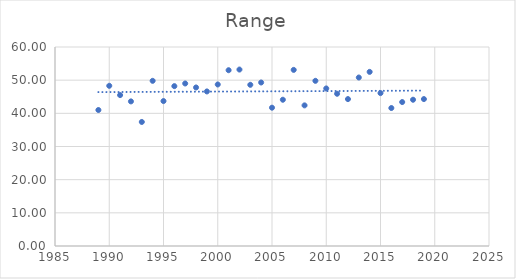
| Category | Range |
|---|---|
| 1989.0 | 41 |
| 1990.0 | 48.3 |
| 1991.0 | 45.5 |
| 1992.0 | 43.6 |
| 1993.0 | 37.4 |
| 1994.0 | 49.8 |
| 1995.0 | 43.7 |
| 1996.0 | 48.2 |
| 1997.0 | 49 |
| 1998.0 | 47.8 |
| 1999.0 | 46.6 |
| 2000.0 | 48.7 |
| 2001.0 | 53 |
| 2002.0 | 53.2 |
| 2003.0 | 48.6 |
| 2004.0 | 49.3 |
| 2005.0 | 41.7 |
| 2006.0 | 44.1 |
| 2007.0 | 53.1 |
| 2008.0 | 42.4 |
| 2009.0 | 49.8 |
| 2010.0 | 47.5 |
| 2011.0 | 45.9 |
| 2012.0 | 44.3 |
| 2013.0 | 50.8 |
| 2014.0 | 52.5 |
| 2015.0 | 46.1 |
| 2016.0 | 41.6 |
| 2017.0 | 43.4 |
| 2018.0 | 44.1 |
| 2019.0 | 44.3 |